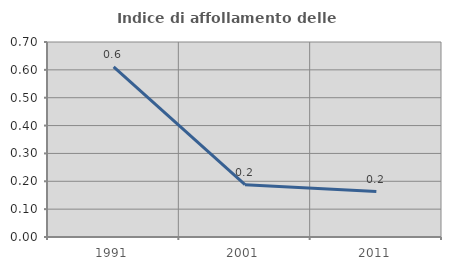
| Category | Indice di affollamento delle abitazioni  |
|---|---|
| 1991.0 | 0.611 |
| 2001.0 | 0.188 |
| 2011.0 | 0.163 |